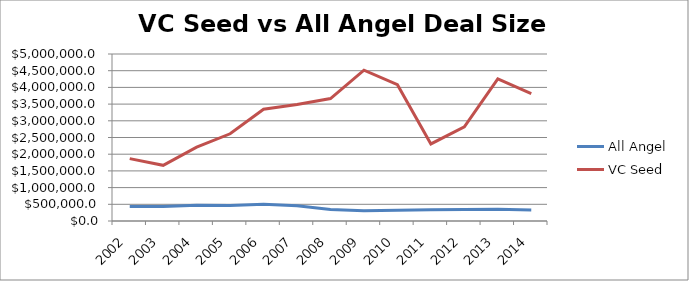
| Category | All Angel  | VC Seed |
|---|---|---|
| 2002.0 | 436111.111 | 1868131.868 |
| 2003.0 | 430952.381 | 1666666.667 |
| 2004.0 | 468750 | 2209401.709 |
| 2005.0 | 466666.667 | 2610687.023 |
| 2006.0 | 501960.784 | 3346633.416 |
| 2007.0 | 455182.073 | 3489523.81 |
| 2008.0 | 346070.656 | 3664794.007 |
| 2009.0 | 307557.886 | 4514745.308 |
| 2010.0 | 324717.286 | 4081081.081 |
| 2011.0 | 339725.2 | 2308219.178 |
| 2012.0 | 341638.073 | 2817880.795 |
| 2013.0 | 350629.153 | 4254166.667 |
| 2014.0 | 328337.875 | 3815384.615 |